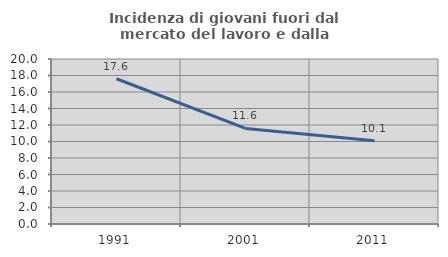
| Category | Incidenza di giovani fuori dal mercato del lavoro e dalla formazione  |
|---|---|
| 1991.0 | 17.606 |
| 2001.0 | 11.579 |
| 2011.0 | 10.101 |